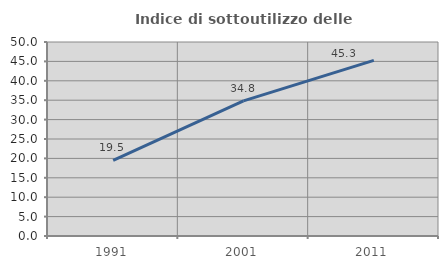
| Category | Indice di sottoutilizzo delle abitazioni  |
|---|---|
| 1991.0 | 19.472 |
| 2001.0 | 34.831 |
| 2011.0 | 45.263 |